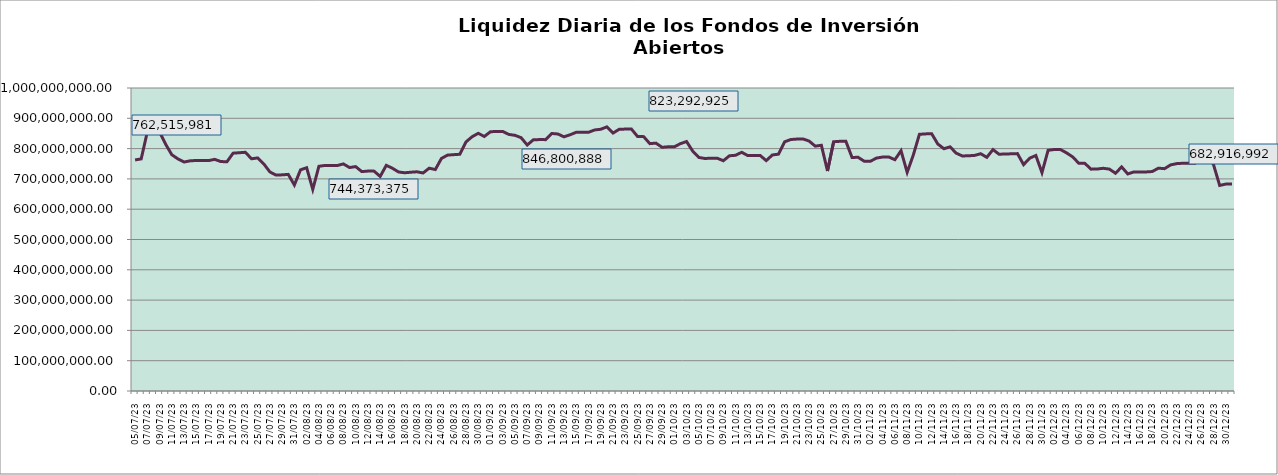
| Category | Series 0 |
|---|---|
| 2023-07-05 | 762515980.85 |
| 2023-07-06 | 765999551.97 |
| 2023-07-07 | 855122776.31 |
| 2023-07-08 | 855210943.7 |
| 2023-07-09 | 855118096.82 |
| 2023-07-10 | 813980789.72 |
| 2023-07-11 | 779638837.42 |
| 2023-07-12 | 765984354.15 |
| 2023-07-13 | 755702205.42 |
| 2023-07-14 | 759611551.67 |
| 2023-07-15 | 760877225.51 |
| 2023-07-16 | 760750814.75 |
| 2023-07-17 | 760466410.8 |
| 2023-07-18 | 764445865.94 |
| 2023-07-19 | 757203987.51 |
| 2023-07-20 | 756637018.89 |
| 2023-07-21 | 784956360.32 |
| 2023-07-22 | 786332924.14 |
| 2023-07-23 | 787829955.34 |
| 2023-07-24 | 766407524.75 |
| 2023-07-25 | 769214163.04 |
| 2023-07-26 | 749599753.52 |
| 2023-07-27 | 723085701.35 |
| 2023-07-28 | 712480204.43 |
| 2023-07-29 | 713383340.65 |
| 2023-07-30 | 714878078.06 |
| 2023-07-31 | 679796450.76 |
| 2023-08-01 | 729861333.08 |
| 2023-08-02 | 736874427.36 |
| 2023-08-03 | 665318775.67 |
| 2023-08-04 | 741630206.97 |
| 2023-08-05 | 744373375.25 |
| 2023-08-06 | 744244089.34 |
| 2023-08-07 | 744156721.15 |
| 2023-08-08 | 749436294.31 |
| 2023-08-09 | 737541120.52 |
| 2023-08-10 | 740581950.01 |
| 2023-08-11 | 724080601.72 |
| 2023-08-12 | 725788397.34 |
| 2023-08-13 | 725649372.75 |
| 2023-08-14 | 708067960.8 |
| 2023-08-15 | 744803219.59 |
| 2023-08-16 | 735083408.49 |
| 2023-08-17 | 722859996.71 |
| 2023-08-18 | 720251296.81 |
| 2023-08-19 | 722066163.03 |
| 2023-08-20 | 723480147.63 |
| 2023-08-21 | 719544022.09 |
| 2023-08-22 | 735338465.03 |
| 2023-08-23 | 730883380.15 |
| 2023-08-24 | 767500076.65 |
| 2023-08-25 | 778542441.96 |
| 2023-08-26 | 779996982.01 |
| 2023-08-27 | 781275232.08 |
| 2023-08-28 | 821975308.4 |
| 2023-08-29 | 839149402.66 |
| 2023-08-30 | 850388672.3 |
| 2023-08-31 | 840083050.96 |
| 2023-09-01 | 855717371.21 |
| 2023-09-02 | 856447592.74 |
| 2023-09-03 | 856518443.03 |
| 2023-09-04 | 846800888.01 |
| 2023-09-05 | 843799303.73 |
| 2023-09-06 | 836064243.98 |
| 2023-09-07 | 811835895.2 |
| 2023-09-08 | 829200588.03 |
| 2023-09-09 | 829710703.66 |
| 2023-09-10 | 829589151.05 |
| 2023-09-11 | 849892786.18 |
| 2023-09-12 | 848258732.7 |
| 2023-09-13 | 838817623.5 |
| 2023-09-14 | 845684000.27 |
| 2023-09-15 | 853912064.49 |
| 2023-09-16 | 854003181.36 |
| 2023-09-17 | 853882893.87 |
| 2023-09-18 | 861587443.4 |
| 2023-09-19 | 863825271.92 |
| 2023-09-20 | 871739708.28 |
| 2023-09-21 | 851274397.87 |
| 2023-09-22 | 863690740.26 |
| 2023-09-23 | 864423462.74 |
| 2023-09-24 | 864495939.38 |
| 2023-09-25 | 840094915.65 |
| 2023-09-26 | 839493871.47 |
| 2023-09-27 | 816397016.16 |
| 2023-09-28 | 818057445.14 |
| 2023-09-29 | 804357452.04 |
| 2023-09-30 | 805987241.89 |
| 2023-10-01 | 805861177.96 |
| 2023-10-02 | 816400848.97 |
| 2023-10-03 | 823292924.62 |
| 2023-10-04 | 791885328.33 |
| 2023-10-05 | 770805388.24 |
| 2023-10-06 | 767335904.7 |
| 2023-10-07 | 768415448.37 |
| 2023-10-08 | 768284658.47 |
| 2023-10-09 | 759931172.94 |
| 2023-10-10 | 776307966.06 |
| 2023-10-11 | 777978215.8 |
| 2023-10-12 | 787829367.49 |
| 2023-10-13 | 776843829.35 |
| 2023-10-14 | 776920366.75 |
| 2023-10-15 | 777520156.16 |
| 2023-10-16 | 760311511.08 |
| 2023-10-17 | 778972902.37 |
| 2023-10-18 | 781669931.69 |
| 2023-10-19 | 822356076.87 |
| 2023-10-20 | 829958566.75 |
| 2023-10-21 | 831436078.01 |
| 2023-10-22 | 831858452.66 |
| 2023-10-23 | 824908511.09 |
| 2023-10-24 | 808109378.63 |
| 2023-10-25 | 810985013.22 |
| 2023-10-26 | 726083306.33 |
| 2023-10-27 | 822647422.52 |
| 2023-10-28 | 824001909.86 |
| 2023-10-29 | 823876506.61 |
| 2023-10-30 | 770919488.28 |
| 2023-10-31 | 771130577.98 |
| 2023-11-01 | 758264332.87 |
| 2023-11-02 | 758373803.82 |
| 2023-11-03 | 768714983.43 |
| 2023-11-04 | 772179484.49 |
| 2023-11-05 | 772323569.13 |
| 2023-11-06 | 763367951.57 |
| 2023-11-07 | 792983502.5 |
| 2023-11-08 | 721638313.77 |
| 2023-11-09 | 778664606.79 |
| 2023-11-10 | 847133613.42 |
| 2023-11-11 | 848551214.1 |
| 2023-11-12 | 849139213.45 |
| 2023-11-13 | 815078203.41 |
| 2023-11-14 | 799630243.1 |
| 2023-11-15 | 805792345.1 |
| 2023-11-16 | 785029389.34 |
| 2023-11-17 | 775716450.94 |
| 2023-11-18 | 776309591.81 |
| 2023-11-19 | 777555671.55 |
| 2023-11-20 | 783102557.43 |
| 2023-11-21 | 771135511.34 |
| 2023-11-22 | 796718313.71 |
| 2023-11-23 | 781344537.67 |
| 2023-11-24 | 782266750.8 |
| 2023-11-25 | 782726600.14 |
| 2023-11-26 | 783455376.83 |
| 2023-11-27 | 747065225.8 |
| 2023-11-28 | 768489871.93 |
| 2023-11-29 | 777269842.82 |
| 2023-11-30 | 720652886.48 |
| 2023-12-01 | 794413077.37 |
| 2023-12-02 | 796941939.55 |
| 2023-12-03 | 797061690.61 |
| 2023-12-04 | 786052940.1 |
| 2023-12-05 | 772705894.99 |
| 2023-12-06 | 751866529.5 |
| 2023-12-07 | 751273612.08 |
| 2023-12-08 | 732200587.07 |
| 2023-12-09 | 732618765.02 |
| 2023-12-10 | 734977990.92 |
| 2023-12-11 | 732335473.7 |
| 2023-12-12 | 718631426.81 |
| 2023-12-13 | 739636751.02 |
| 2023-12-14 | 716352995.32 |
| 2023-12-15 | 723057477.07 |
| 2023-12-16 | 722889458.85 |
| 2023-12-17 | 722984908.96 |
| 2023-12-18 | 724345793.57 |
| 2023-12-19 | 735446579.01 |
| 2023-12-20 | 733743517.41 |
| 2023-12-21 | 746283219.33 |
| 2023-12-22 | 750445223.45 |
| 2023-12-23 | 751642183.57 |
| 2023-12-24 | 751513402.91 |
| 2023-12-25 | 751628523.3 |
| 2023-12-26 | 776674715.25 |
| 2023-12-27 | 781963225.03 |
| 2023-12-28 | 746551489.31 |
| 2023-12-29 | 678387935.77 |
| 2023-12-30 | 682929910.02 |
| 2023-12-31 | 682916992.01 |